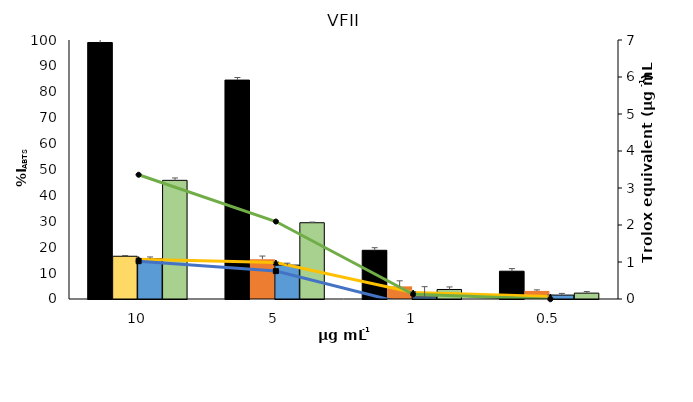
| Category | Trolox | Acetone | MeOH | EtOH 70% |
|---|---|---|---|---|
| 10.0 | 99.04 | 16.505 | 15.58 | 45.816 |
| 5.0 | 84.52 | 15.353 | 13.077 | 29.45 |
| 1.0 | 18.81 | 4.887 | 0.809 | 3.679 |
| 0.5 | 10.73 | 3.124 | 1.509 | 2.265 |